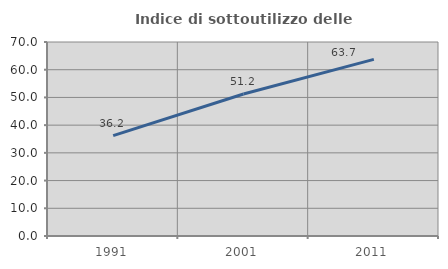
| Category | Indice di sottoutilizzo delle abitazioni  |
|---|---|
| 1991.0 | 36.236 |
| 2001.0 | 51.247 |
| 2011.0 | 63.717 |